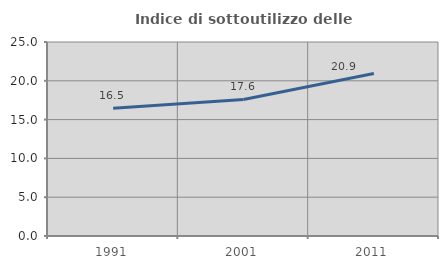
| Category | Indice di sottoutilizzo delle abitazioni  |
|---|---|
| 1991.0 | 16.457 |
| 2001.0 | 17.6 |
| 2011.0 | 20.949 |